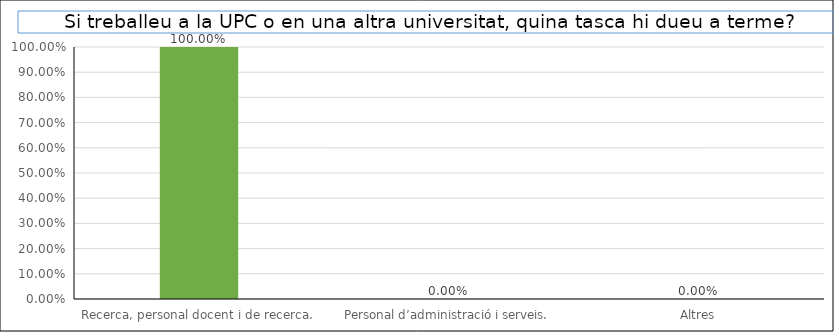
| Category | Series 0 |
|---|---|
| Recerca, personal docent i de recerca. | 1 |
| Personal d’administració i serveis. | 0 |
| Altres | 0 |